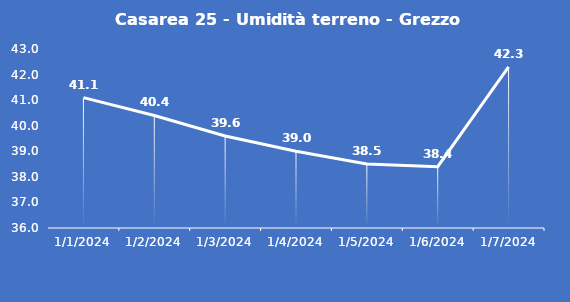
| Category | Casarea 25 - Umidità terreno - Grezzo (%VWC) |
|---|---|
| 1/1/24 | 41.1 |
| 1/2/24 | 40.4 |
| 1/3/24 | 39.6 |
| 1/4/24 | 39 |
| 1/5/24 | 38.5 |
| 1/6/24 | 38.4 |
| 1/7/24 | 42.3 |